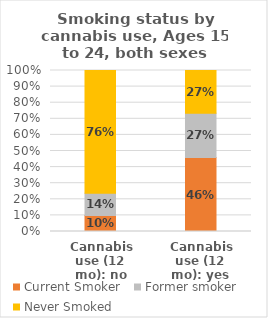
| Category | Current Smoker | Former smoker | Never Smoked |
|---|---|---|---|
| Cannabis use (12 mo): no | 0.1 | 0.138 | 0.762 |
| Cannabis use (12 mo): yes | 0.459 | 0.275 | 0.266 |